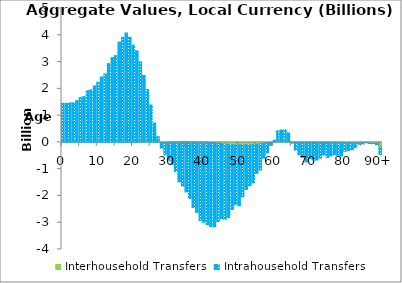
| Category | Interhousehold Transfers | Intrahousehold Transfers |
|---|---|---|
| 0 | 0 | 1468.168 |
|  | 0 | 1455.327 |
| 2 | 0 | 1477.263 |
| 3 | 0 | 1478.345 |
| 4 | 0 | 1560.04 |
| 5 | 0 | 1670.113 |
| 6 | 0 | 1708.879 |
| 7 | 0 | 1933.777 |
| 8 | 0 | 1958.003 |
| 9 | 0 | 2109.521 |
| 10 | 0 | 2248.685 |
| 11 | 0 | 2445.696 |
| 12 | 0 | 2553.392 |
| 13 | 0 | 2942.944 |
| 14 | 0 | 3168.73 |
| 15 | 0 | 3239.059 |
| 16 | 0 | 3743.02 |
| 17 | 0.911 | 3924.201 |
| 18 | 2.074 | 4082.488 |
| 19 | 3.69 | 3921.742 |
| 20 | 5.284 | 3628.838 |
| 21 | 8.609 | 3410.107 |
| 22 | 12.327 | 2996.307 |
| 23 | 18.284 | 2482.557 |
| 24 | 14.115 | 1958.526 |
| 25 | 8.793 | 1387.257 |
| 26 | 7.902 | 713.607 |
| 27 | 7.45 | 205.368 |
| 28 | 1.557 | -213.953 |
| 29 | 6.2 | -462.568 |
| 30 | 17.589 | -667.647 |
| 31 | 25.248 | -817.416 |
| 32 | 31.123 | -1095.768 |
| 33 | 38.104 | -1473.878 |
| 34 | 42.516 | -1639.072 |
| 35 | 41.885 | -1849.785 |
| 36 | 38.282 | -2101.604 |
| 37 | 34.438 | -2431.801 |
| 38 | 32.775 | -2616.101 |
| 39 | 28.251 | -2917.495 |
| 40 | 19.05 | -2982.631 |
| 41 | 9.01 | -3075.359 |
| 42 | -4.564 | -3144.601 |
| 43 | -19.592 | -3133.629 |
| 44 | -29.084 | -2930.571 |
| 45 | -48.277 | -2793.266 |
| 46 | -64.58 | -2810.554 |
| 47 | -74.372 | -2727.747 |
| 48 | -83.192 | -2421.36 |
| 49 | -91.919 | -2235.16 |
| 50 | -92.429 | -2275.824 |
| 51 | -92.649 | -1929.214 |
| 52 | -91.658 | -1663.86 |
| 53 | -90.859 | -1528.118 |
| 54 | -86.864 | -1426.147 |
| 55 | -72.773 | -1081.831 |
| 56 | -51.419 | -978.974 |
| 57 | -32.368 | -557.255 |
| 58 | -11.135 | -382.521 |
| 59 | 3.242 | -109.167 |
| 60 | 13.321 | 63.187 |
| 61 | 19.065 | 413.111 |
| 62 | 22.719 | 438.572 |
| 63 | 21.959 | 445.776 |
| 64 | 23.399 | 328.065 |
| 65 | 23.687 | -27.168 |
| 66 | 19.757 | -288.433 |
| 67 | 15.686 | -460.14 |
| 68 | 14.994 | -561.475 |
| 69 | 16.156 | -730.315 |
| 70 | 14.731 | -594.104 |
| 71 | 14.521 | -657.118 |
| 72 | 13.838 | -657.457 |
| 73 | 12.922 | -587.998 |
| 74 | 11.004 | -472.049 |
| 75 | 11.13 | -567.024 |
| 76 | 10.977 | -506.543 |
| 77 | 6.783 | -457.767 |
| 78 | 2.573 | -483.784 |
| 79 | -1.774 | -506.486 |
| 80 | -8.125 | -327.137 |
| 81 | -11.963 | -288.108 |
| 82 | -16.608 | -259.864 |
| 83 | -19.657 | -179.918 |
| 84 | -17.467 | -52.244 |
| 85 | -19.171 | -46.367 |
| 86 | -22.746 | 0.772 |
| 87 | -18.578 | -23.616 |
| 88 | -31.092 | -14.714 |
| 89 | -38.95 | -50.83 |
| 90+ | -166.067 | -285.902 |